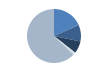
| Category | Series 0 |
|---|---|
| ARRASTRE | 155 |
| CERCO | 84 |
| PALANGRE | 62 |
| REDES DE ENMALLE | 14 |
| ARTES MENORES | 531 |
| SIN TIPO ASIGNADO | 0 |